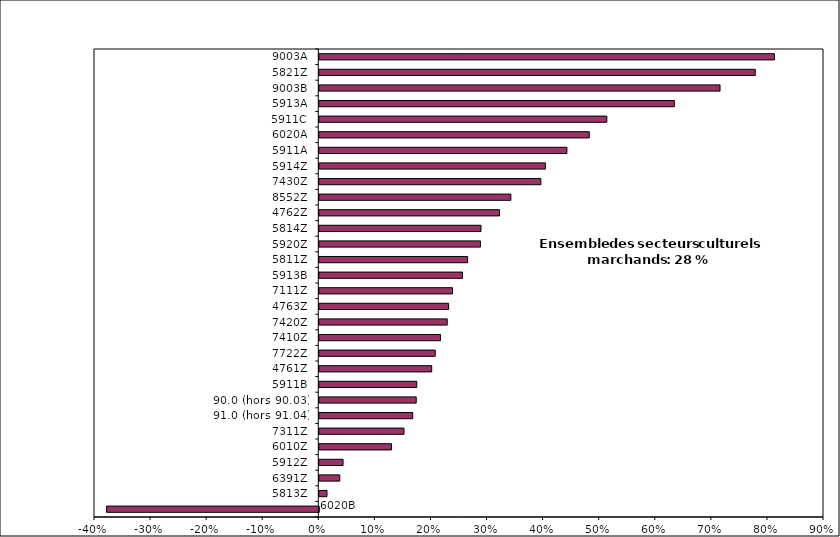
| Category | Series 0 |
|---|---|
|  | -0.378 |
| 5813Z | 0.014 |
| 6391Z | 0.036 |
| 5912Z | 0.042 |
| 6010Z | 0.129 |
| 7311Z | 0.151 |
| 91.0 (hors 91.04) | 0.167 |
| 90.0 (hors 90.03) | 0.173 |
| 5911B | 0.174 |
| 4761Z | 0.2 |
| 7722Z | 0.207 |
| 7410Z | 0.216 |
| 7420Z | 0.228 |
| 4763Z | 0.231 |
| 7111Z | 0.237 |
| 5913B | 0.255 |
| 5811Z | 0.264 |
| 5920Z | 0.287 |
| 5814Z | 0.288 |
| 4762Z | 0.321 |
| 8552Z | 0.342 |
| 7430Z | 0.395 |
| 5914Z | 0.403 |
| 5911A | 0.442 |
| 6020A | 0.481 |
| 5911C | 0.513 |
| 5913A | 0.633 |
| 9003B | 0.715 |
| 5821Z | 0.777 |
| 9003A | 0.812 |